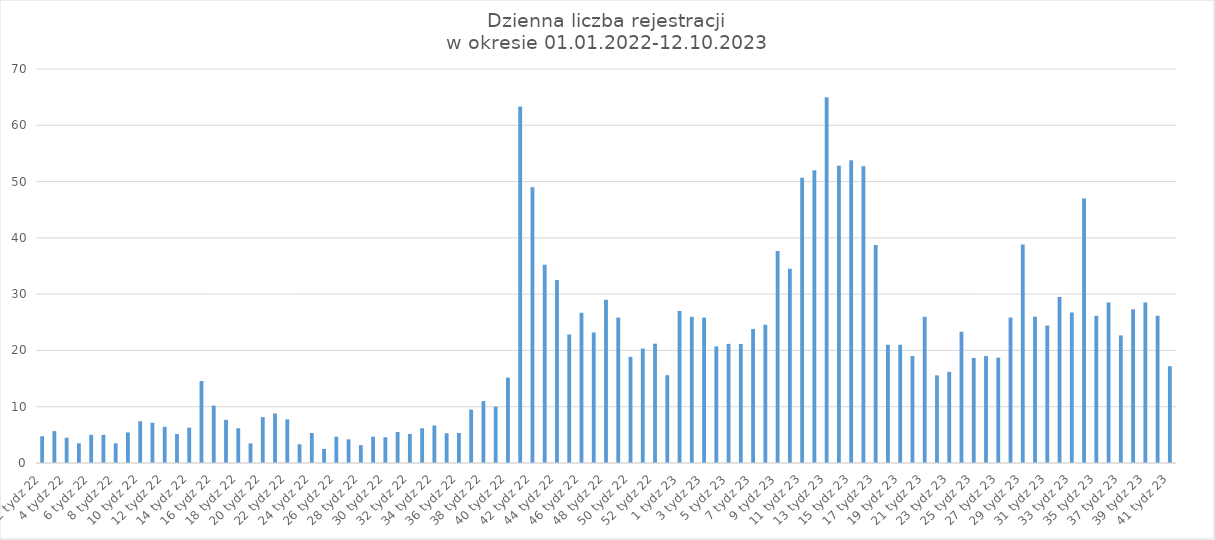
| Category | Series 0 |
|---|---|
| 2 tydz 22 | 4.75 |
| 3 tydz 22 | 5.667 |
| 4 tydz 22 | 4.5 |
| 5 tydz 22 | 3.5 |
| 6 tydz 22 | 5 |
| 7 tydz 22 | 5 |
| 8 tydz 22 | 3.5 |
| 9 tydz 22 | 5.429 |
| 10 tydz 22 | 7.429 |
| 11 tydz 22 | 7.143 |
| 12 tydz 22 | 6.429 |
| 13 tydz 22 | 5.143 |
| 14 tydz 22 | 6.286 |
| 15 tydz 22 | 14.571 |
| 16 tydz 22 | 10.2 |
| 17 tydz 22 | 7.667 |
| 18 tydz 22 | 6.167 |
| 19 tydz 22 | 3.5 |
| 20 tydz 22 | 8.167 |
| 21 tydz 22 | 8.8 |
| 22 tydz 22 | 7.75 |
| 23 tydz 22 | 3.333 |
| 24 tydz 22 | 5.333 |
| 25 tydz 22 | 2.5 |
| 26 tydz 22 | 4.667 |
| 27 tydz 22 | 4.2 |
| 28 tydz 22 | 3.167 |
| 29 tydz 22 | 4.667 |
| 30 tydz 22 | 4.571 |
| 31 tydz 22 | 5.5 |
| 32 tydz 22 | 5.167 |
| 33 tydz 22 | 6.167 |
| 34 tydz 22 | 6.667 |
| 35 tydz 22 | 5.286 |
| 36 tydz 22 | 5.333 |
| 37 tydz 22 | 9.5 |
| 38 tydz 22 | 11 |
| 39 tydz 22 | 10 |
| 40 tydz 22 | 15.167 |
| 41 tydz 22 | 63.333 |
| 42 tydz 22 | 49 |
| 43 tydz 22 | 35.2 |
| 44 tydz 22 | 32.5 |
| 45 tydz 22 | 22.833 |
| 46 tydz 22 | 26.714 |
| 47 tydz 22 | 23.167 |
| 48 tydz 22 | 29 |
| 49 tydz 22 | 25.833 |
| 50 tydz 22 | 18.857 |
| 51 tydz 22 | 20.333 |
| 52 tydz 22 | 21.2 |
| 53 tydz 22 | 15.6 |
| 1 tydz 23 | 27 |
| 2 tydz 23 | 26 |
| 3 tydz 23 | 25.833 |
| 4 tydz 23 | 20.714 |
| 5 tydz 23 | 21.167 |
| 6 tydz 23 | 21.143 |
| 7 tydz 23 | 23.8 |
| 8 tydz 23 | 24.571 |
| 9 tydz 23 | 37.667 |
| 10 tydz 23 | 34.5 |
| 11 tydz 23 | 50.667 |
| 12 tydz 23 | 52 |
| 13 tydz 23 | 65 |
| 14 tydz 23 | 52.8 |
| 15 tydz 23 | 53.8 |
| 16 tydz 23 | 52.714 |
| 17 tydz 23 | 38.714 |
| 18 tydz 23 | 21 |
| 19 tydz 23 | 21 |
| 20 tydz 23 | 19 |
| 21 tydz 23 | 26 |
| 22 tydz 23 | 15.571 |
| 23 tydz 23 | 16.2 |
| 24 tydz 23 | 23.333 |
| 25 tydz 23 | 18.667 |
| 26 tydz 23 | 19 |
| 27 tydz 23 | 18.714 |
| 28 tydz 23 | 25.833 |
| 29 tydz 23 | 38.8 |
| 30 tydz 23 | 26 |
| 31 tydz 23 | 24.429 |
| 32 tydz 23 | 29.5 |
| 33 tydz 23 | 26.75 |
| 34 tydz 23 | 47 |
| 35 tydz 23 | 26.143 |
| 36 tydz 23 | 28.5 |
| 37 tydz 23 | 22.667 |
| 38 tydz 23 | 27.333 |
| 39 tydz 23 | 28.5 |
| 40 tydz 23 | 26.14 |
| 41 tydz 23 | 17.2 |